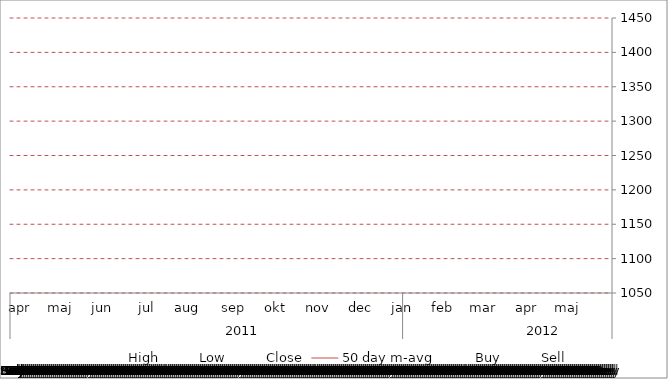
| Category | High | Low | Close |
|---|---|---|---|
| 0 | 0 | 0 | 0 |
| 1900-01-01 | 0 | 0 | 0 |
| 1900-01-02 | 0 | 0 | 0 |
| 1900-01-03 | 0 | 0 | 0 |
| 1900-01-04 | 0 | 0 | 0 |
| 1900-01-05 | 0 | 0 | 0 |
| 1900-01-06 | 0 | 0 | 0 |
| 1900-01-07 | 0 | 0 | 0 |
| 1900-01-08 | 0 | 0 | 0 |
| 1900-01-09 | 0 | 0 | 0 |
| 1900-01-10 | 0 | 0 | 0 |
| 1900-01-11 | 0 | 0 | 0 |
| 1900-01-12 | 0 | 0 | 0 |
| 1900-01-13 | 0 | 0 | 0 |
| 1900-01-14 | 0 | 0 | 0 |
| 1900-01-15 | 0 | 0 | 0 |
| 1900-01-16 | 0 | 0 | 0 |
| 1900-01-17 | 0 | 0 | 0 |
| 1900-01-18 | 0 | 0 | 0 |
| 1900-01-19 | 0 | 0 | 0 |
| 1900-01-20 | 0 | 0 | 0 |
| 1900-01-21 | 0 | 0 | 0 |
| 1900-01-22 | 0 | 0 | 0 |
| 1900-01-23 | 0 | 0 | 0 |
| 1900-01-24 | 0 | 0 | 0 |
| 1900-01-25 | 0 | 0 | 0 |
| 1900-01-26 | 0 | 0 | 0 |
| 1900-01-27 | 0 | 0 | 0 |
| 1900-01-28 | 0 | 0 | 0 |
| 1900-01-29 | 0 | 0 | 0 |
| 1900-01-30 | 0 | 0 | 0 |
| 1900-01-31 | 0 | 0 | 0 |
| 1900-02-01 | 0 | 0 | 0 |
| 1900-02-02 | 0 | 0 | 0 |
| 1900-02-03 | 0 | 0 | 0 |
| 1900-02-04 | 0 | 0 | 0 |
| 1900-02-05 | 0 | 0 | 0 |
| 1900-02-06 | 0 | 0 | 0 |
| 1900-02-07 | 0 | 0 | 0 |
| 1900-02-08 | 0 | 0 | 0 |
| 1900-02-09 | 0 | 0 | 0 |
| 1900-02-10 | 0 | 0 | 0 |
| 1900-02-11 | 0 | 0 | 0 |
| 1900-02-12 | 0 | 0 | 0 |
| 1900-02-13 | 0 | 0 | 0 |
| 1900-02-14 | 0 | 0 | 0 |
| 1900-02-15 | 0 | 0 | 0 |
| 1900-02-16 | 0 | 0 | 0 |
| 1900-02-17 | 0 | 0 | 0 |
| 1900-02-18 | 0 | 0 | 0 |
| 1900-02-19 | 0 | 0 | 0 |
| 1900-02-20 | 0 | 0 | 0 |
| 1900-02-21 | 0 | 0 | 0 |
| 1900-02-22 | 0 | 0 | 0 |
| 1900-02-23 | 0 | 0 | 0 |
| 1900-02-24 | 0 | 0 | 0 |
| 1900-02-25 | 0 | 0 | 0 |
| 1900-02-26 | 0 | 0 | 0 |
| 1900-02-27 | 0 | 0 | 0 |
| 1900-02-28 | 0 | 0 | 0 |
| 1900-02-28 | 0 | 0 | 0 |
| 1900-03-01 | 0 | 0 | 0 |
| 1900-03-02 | 0 | 0 | 0 |
| 1900-03-03 | 0 | 0 | 0 |
| 1900-03-04 | 0 | 0 | 0 |
| 1900-03-05 | 0 | 0 | 0 |
| 1900-03-06 | 0 | 0 | 0 |
| 1900-03-07 | 0 | 0 | 0 |
| 1900-03-08 | 0 | 0 | 0 |
| 1900-03-09 | 0 | 0 | 0 |
| 1900-03-10 | 0 | 0 | 0 |
| 1900-03-11 | 0 | 0 | 0 |
| 1900-03-12 | 0 | 0 | 0 |
| 1900-03-13 | 0 | 0 | 0 |
| 1900-03-14 | 0 | 0 | 0 |
| 1900-03-15 | 0 | 0 | 0 |
| 1900-03-16 | 0 | 0 | 0 |
| 1900-03-17 | 0 | 0 | 0 |
| 1900-03-18 | 0 | 0 | 0 |
| 1900-03-19 | 0 | 0 | 0 |
| 1900-03-20 | 0 | 0 | 0 |
| 1900-03-21 | 0 | 0 | 0 |
| 1900-03-22 | 0 | 0 | 0 |
| 1900-03-23 | 0 | 0 | 0 |
| 1900-03-24 | 0 | 0 | 0 |
| 1900-03-25 | 0 | 0 | 0 |
| 1900-03-26 | 0 | 0 | 0 |
| 1900-03-27 | 0 | 0 | 0 |
| 1900-03-28 | 0 | 0 | 0 |
| 1900-03-29 | 0 | 0 | 0 |
| 1900-03-30 | 0 | 0 | 0 |
| 1900-03-31 | 0 | 0 | 0 |
| 1900-04-01 | 0 | 0 | 0 |
| 1900-04-02 | 0 | 0 | 0 |
| 1900-04-03 | 0 | 0 | 0 |
| 1900-04-04 | 0 | 0 | 0 |
| 1900-04-05 | 0 | 0 | 0 |
| 1900-04-06 | 0 | 0 | 0 |
| 1900-04-07 | 0 | 0 | 0 |
| 1900-04-08 | 0 | 0 | 0 |
| 1900-04-09 | 0 | 0 | 0 |
| 1900-04-10 | 0 | 0 | 0 |
| 1900-04-11 | 0 | 0 | 0 |
| 1900-04-12 | 0 | 0 | 0 |
| 1900-04-13 | 0 | 0 | 0 |
| 1900-04-14 | 0 | 0 | 0 |
| 1900-04-15 | 0 | 0 | 0 |
| 1900-04-16 | 0 | 0 | 0 |
| 1900-04-17 | 0 | 0 | 0 |
| 1900-04-18 | 0 | 0 | 0 |
| 1900-04-19 | 0 | 0 | 0 |
| 1900-04-20 | 0 | 0 | 0 |
| 1900-04-21 | 0 | 0 | 0 |
| 1900-04-22 | 0 | 0 | 0 |
| 1900-04-23 | 0 | 0 | 0 |
| 1900-04-24 | 0 | 0 | 0 |
| 1900-04-25 | 0 | 0 | 0 |
| 1900-04-26 | 0 | 0 | 0 |
| 1900-04-27 | 0 | 0 | 0 |
| 1900-04-28 | 0 | 0 | 0 |
| 1900-04-29 | 0 | 0 | 0 |
| 1900-04-30 | 0 | 0 | 0 |
| 1900-05-01 | 0 | 0 | 0 |
| 1900-05-02 | 0 | 0 | 0 |
| 1900-05-03 | 0 | 0 | 0 |
| 1900-05-04 | 0 | 0 | 0 |
| 1900-05-05 | 0 | 0 | 0 |
| 1900-05-06 | 0 | 0 | 0 |
| 1900-05-07 | 0 | 0 | 0 |
| 1900-05-08 | 0 | 0 | 0 |
| 1900-05-09 | 0 | 0 | 0 |
| 1900-05-10 | 0 | 0 | 0 |
| 1900-05-11 | 0 | 0 | 0 |
| 1900-05-12 | 0 | 0 | 0 |
| 1900-05-13 | 0 | 0 | 0 |
| 1900-05-14 | 0 | 0 | 0 |
| 1900-05-15 | 0 | 0 | 0 |
| 1900-05-16 | 0 | 0 | 0 |
| 1900-05-17 | 0 | 0 | 0 |
| 1900-05-18 | 0 | 0 | 0 |
| 1900-05-19 | 0 | 0 | 0 |
| 1900-05-20 | 0 | 0 | 0 |
| 1900-05-21 | 0 | 0 | 0 |
| 1900-05-22 | 0 | 0 | 0 |
| 1900-05-23 | 0 | 0 | 0 |
| 1900-05-24 | 0 | 0 | 0 |
| 1900-05-25 | 0 | 0 | 0 |
| 1900-05-26 | 0 | 0 | 0 |
| 1900-05-27 | 0 | 0 | 0 |
| 1900-05-28 | 0 | 0 | 0 |
| 1900-05-29 | 0 | 0 | 0 |
| 1900-05-30 | 0 | 0 | 0 |
| 1900-05-31 | 0 | 0 | 0 |
| 1900-06-01 | 0 | 0 | 0 |
| 1900-06-02 | 0 | 0 | 0 |
| 1900-06-03 | 0 | 0 | 0 |
| 1900-06-04 | 0 | 0 | 0 |
| 1900-06-05 | 0 | 0 | 0 |
| 1900-06-06 | 0 | 0 | 0 |
| 1900-06-07 | 0 | 0 | 0 |
| 1900-06-08 | 0 | 0 | 0 |
| 1900-06-09 | 0 | 0 | 0 |
| 1900-06-10 | 0 | 0 | 0 |
| 1900-06-11 | 0 | 0 | 0 |
| 1900-06-12 | 0 | 0 | 0 |
| 1900-06-13 | 0 | 0 | 0 |
| 1900-06-14 | 0 | 0 | 0 |
| 1900-06-15 | 0 | 0 | 0 |
| 1900-06-16 | 0 | 0 | 0 |
| 1900-06-17 | 0 | 0 | 0 |
| 1900-06-18 | 0 | 0 | 0 |
| 1900-06-19 | 0 | 0 | 0 |
| 1900-06-20 | 0 | 0 | 0 |
| 1900-06-21 | 0 | 0 | 0 |
| 1900-06-22 | 0 | 0 | 0 |
| 1900-06-23 | 0 | 0 | 0 |
| 1900-06-24 | 0 | 0 | 0 |
| 1900-06-25 | 0 | 0 | 0 |
| 1900-06-26 | 0 | 0 | 0 |
| 1900-06-27 | 0 | 0 | 0 |
| 1900-06-28 | 0 | 0 | 0 |
| 1900-06-29 | 0 | 0 | 0 |
| 1900-06-30 | 0 | 0 | 0 |
| 1900-07-01 | 0 | 0 | 0 |
| 1900-07-02 | 0 | 0 | 0 |
| 1900-07-03 | 0 | 0 | 0 |
| 1900-07-04 | 0 | 0 | 0 |
| 1900-07-05 | 0 | 0 | 0 |
| 1900-07-06 | 0 | 0 | 0 |
| 1900-07-07 | 0 | 0 | 0 |
| 1900-07-08 | 0 | 0 | 0 |
| 1900-07-09 | 0 | 0 | 0 |
| 1900-07-10 | 0 | 0 | 0 |
| 1900-07-11 | 0 | 0 | 0 |
| 1900-07-12 | 0 | 0 | 0 |
| 1900-07-13 | 0 | 0 | 0 |
| 1900-07-14 | 0 | 0 | 0 |
| 1900-07-15 | 0 | 0 | 0 |
| 1900-07-16 | 0 | 0 | 0 |
| 1900-07-17 | 0 | 0 | 0 |
| 1900-07-18 | 0 | 0 | 0 |
| 1900-07-19 | 0 | 0 | 0 |
| 1900-07-20 | 0 | 0 | 0 |
| 1900-07-21 | 0 | 0 | 0 |
| 1900-07-22 | 0 | 0 | 0 |
| 1900-07-23 | 0 | 0 | 0 |
| 1900-07-24 | 0 | 0 | 0 |
| 1900-07-25 | 0 | 0 | 0 |
| 1900-07-26 | 0 | 0 | 0 |
| 1900-07-27 | 0 | 0 | 0 |
| 1900-07-28 | 0 | 0 | 0 |
| 1900-07-29 | 0 | 0 | 0 |
| 1900-07-30 | 0 | 0 | 0 |
| 1900-07-31 | 0 | 0 | 0 |
| 1900-08-01 | 0 | 0 | 0 |
| 1900-08-02 | 0 | 0 | 0 |
| 1900-08-03 | 0 | 0 | 0 |
| 1900-08-04 | 0 | 0 | 0 |
| 1900-08-05 | 0 | 0 | 0 |
| 1900-08-06 | 0 | 0 | 0 |
| 1900-08-07 | 0 | 0 | 0 |
| 1900-08-08 | 0 | 0 | 0 |
| 1900-08-09 | 0 | 0 | 0 |
| 1900-08-10 | 0 | 0 | 0 |
| 1900-08-11 | 0 | 0 | 0 |
| 1900-08-12 | 0 | 0 | 0 |
| 1900-08-13 | 0 | 0 | 0 |
| 1900-08-14 | 0 | 0 | 0 |
| 1900-08-15 | 0 | 0 | 0 |
| 1900-08-16 | 0 | 0 | 0 |
| 1900-08-17 | 0 | 0 | 0 |
| 1900-08-18 | 0 | 0 | 0 |
| 1900-08-19 | 0 | 0 | 0 |
| 1900-08-20 | 0 | 0 | 0 |
| 1900-08-21 | 0 | 0 | 0 |
| 1900-08-22 | 0 | 0 | 0 |
| 1900-08-23 | 0 | 0 | 0 |
| 1900-08-24 | 0 | 0 | 0 |
| 1900-08-25 | 0 | 0 | 0 |
| 1900-08-26 | 0 | 0 | 0 |
| 1900-08-27 | 0 | 0 | 0 |
| 1900-08-28 | 0 | 0 | 0 |
| 1900-08-29 | 0 | 0 | 0 |
| 1900-08-30 | 0 | 0 | 0 |
| 1900-08-31 | 0 | 0 | 0 |
| 1900-09-01 | 0 | 0 | 0 |
| 1900-09-02 | 0 | 0 | 0 |
| 1900-09-03 | 0 | 0 | 0 |
| 1900-09-04 | 0 | 0 | 0 |
| 1900-09-05 | 0 | 0 | 0 |
| 1900-09-06 | 0 | 0 | 0 |
| 1900-09-07 | 0 | 0 | 0 |
| 1900-09-08 | 0 | 0 | 0 |
| 1900-09-09 | 0 | 0 | 0 |
| 1900-09-10 | 0 | 0 | 0 |
| 1900-09-11 | 0 | 0 | 0 |
| 1900-09-12 | 0 | 0 | 0 |
| 1900-09-13 | 0 | 0 | 0 |
| 1900-09-14 | 0 | 0 | 0 |
| 1900-09-15 | 0 | 0 | 0 |
| 1900-09-16 | 0 | 0 | 0 |
| 1900-09-17 | 0 | 0 | 0 |
| 1900-09-18 | 0 | 0 | 0 |
| 1900-09-19 | 0 | 0 | 0 |
| 1900-09-20 | 0 | 0 | 0 |
| 1900-09-21 | 0 | 0 | 0 |
| 1900-09-22 | 0 | 0 | 0 |
| 1900-09-23 | 0 | 0 | 0 |
| 1900-09-24 | 0 | 0 | 0 |
| 1900-09-25 | 0 | 0 | 0 |
| 1900-09-26 | 0 | 0 | 0 |
| 1900-09-27 | 0 | 0 | 0 |
| 1900-09-28 | 0 | 0 | 0 |
| 1900-09-29 | 0 | 0 | 0 |
| 1900-09-30 | 0 | 0 | 0 |
| 1900-10-01 | 0 | 0 | 0 |
| 1900-10-02 | 0 | 0 | 0 |
| 1900-10-03 | 0 | 0 | 0 |
| 1900-10-04 | 0 | 0 | 0 |
| 1900-10-05 | 0 | 0 | 0 |
| 1900-10-06 | 0 | 0 | 0 |
| 1900-10-07 | 0 | 0 | 0 |
| 1900-10-08 | 0 | 0 | 0 |
| 1900-10-09 | 0 | 0 | 0 |
| 1900-10-10 | 0 | 0 | 0 |
| 1900-10-11 | 0 | 0 | 0 |
| 1900-10-12 | 0 | 0 | 0 |
| 1900-10-13 | 0 | 0 | 0 |
| 1900-10-14 | 0 | 0 | 0 |
| 1900-10-15 | 0 | 0 | 0 |
| 1900-10-16 | 0 | 0 | 0 |
| 1900-10-17 | 0 | 0 | 0 |
| 1900-10-18 | 0 | 0 | 0 |
| 1900-10-19 | 0 | 0 | 0 |
| 1900-10-20 | 0 | 0 | 0 |
| 1900-10-21 | 0 | 0 | 0 |
| 1900-10-22 | 0 | 0 | 0 |
| 1900-10-23 | 0 | 0 | 0 |
| 1900-10-24 | 0 | 0 | 0 |